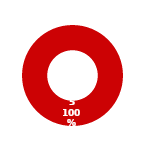
| Category | ISC |
|---|---|
| MIL 2 Complete | 0 |
| MIL 2 Not Complete | 5 |